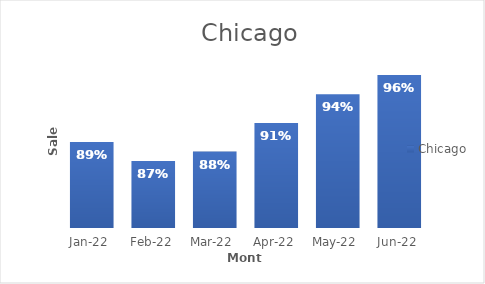
| Category | Chicago |
|---|---|
| 2022-01-01 | 0.89 |
| 2022-02-01 | 0.87 |
| 2022-03-01 | 0.88 |
| 2022-04-01 | 0.91 |
| 2022-05-01 | 0.94 |
| 2022-06-01 | 0.96 |